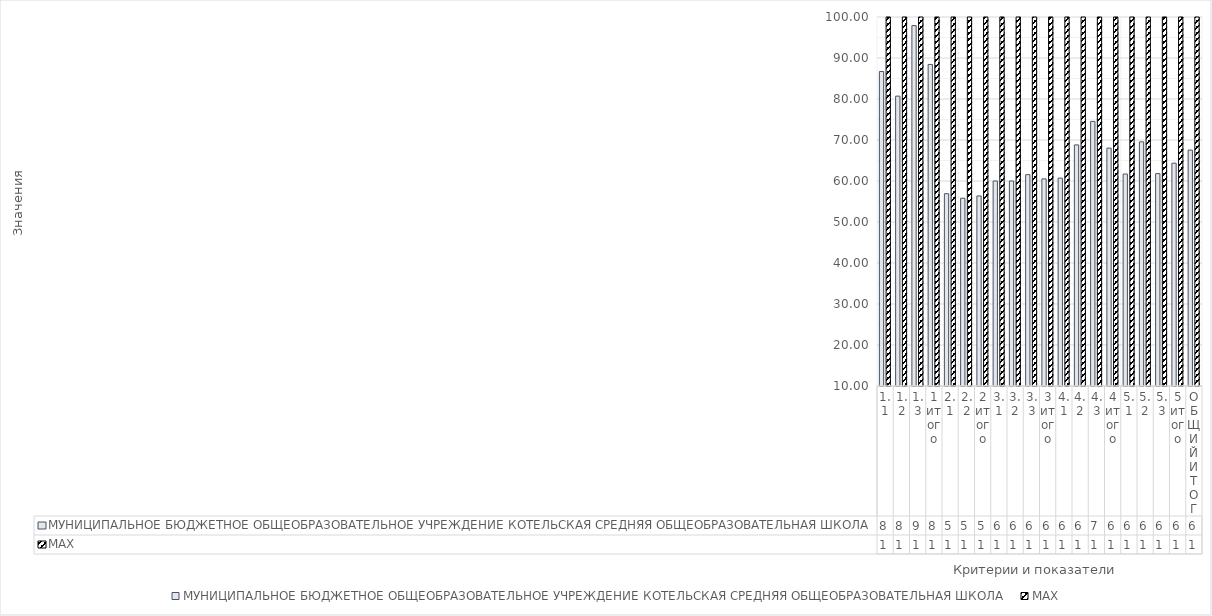
| Category | МУНИЦИПАЛЬНОЕ БЮДЖЕТНОЕ ОБЩЕОБРАЗОВАТЕЛЬНОЕ УЧРЕЖДЕНИЕ КОТЕЛЬСКАЯ СРЕДНЯЯ ОБЩЕОБРАЗОВАТЕЛЬНАЯ ШКОЛА | MAX |
|---|---|---|
| 1.1 | 86.7 | 100 |
| 1.2 | 80.7 | 100 |
| 1.3 | 97.9 | 100 |
| 1 итого | 88.433 | 100 |
| 2.1 | 56.9 | 100 |
| 2.2 | 55.8 | 100 |
| 2 итого | 56.35 | 100 |
| 3,1 | 60 | 100 |
| 3,2 | 60 | 100 |
| 3,3 | 61.55 | 100 |
| 3 итого | 60.517 | 100 |
| 4,1 | 60.7 | 100 |
| 4,2 | 68.8 | 100 |
| 4,3 | 74.54 | 100 |
| 4 итого | 68.013 | 100 |
| 5,1 | 61.7 | 100 |
| 5,2 | 69.55 | 100 |
| 5,3 | 61.8 | 100 |
| 5 итого | 64.35 | 100 |
| ОБЩИЙ ИТОГ | 67.533 | 100 |